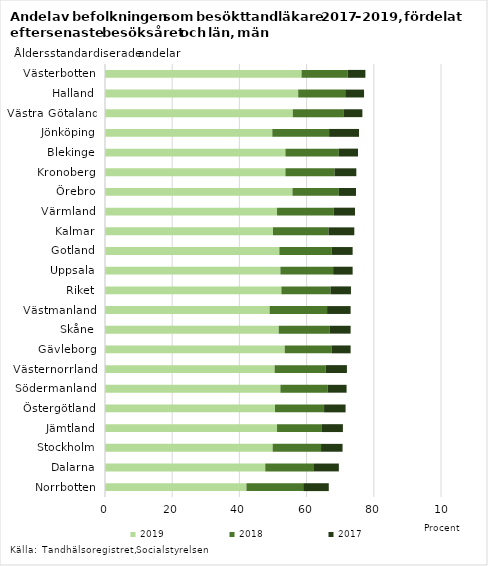
| Category | 2019 | 2018 | 2017 |
|---|---|---|---|
| Norrbotten | 42.1 | 16.9 | 7.6 |
| Dalarna | 47.7 | 14.3 | 7.6 |
| Stockholm | 49.9 | 14.4 | 6.4 |
| Jämtland | 51.2 | 13.2 | 6.4 |
| Östergötland | 50.6 | 14.6 | 6.4 |
| Södermanland | 52.2 | 14.1 | 5.6 |
| Västernorrland | 50.5 | 15.2 | 6.3 |
| Gävleborg | 53.5 | 13.9 | 5.7 |
| Skåne | 51.7 | 15.1 | 6.3 |
| Västmanland | 49 | 17.1 | 7 |
| Riket | 52.5 | 14.6 | 6.1 |
| Uppsala | 52.2 | 15.7 | 5.8 |
| Gotland | 51.9 | 15.6 | 6.2 |
| Kalmar | 50 | 16.5 | 7.7 |
| Värmland | 51.2 | 16.9 | 6.3 |
| Örebro | 55.8 | 13.8 | 5.1 |
| Kronoberg | 53.7 | 14.6 | 6.5 |
| Blekinge | 53.7 | 15.9 | 5.7 |
| Jönköping | 49.8 | 16.9 | 8.9 |
| Västra Götaland | 55.9 | 15.2 | 5.5 |
| Halland | 57.5 | 14 | 5.6 |
| Västerbotten | 58.5 | 13.7 | 5.3 |